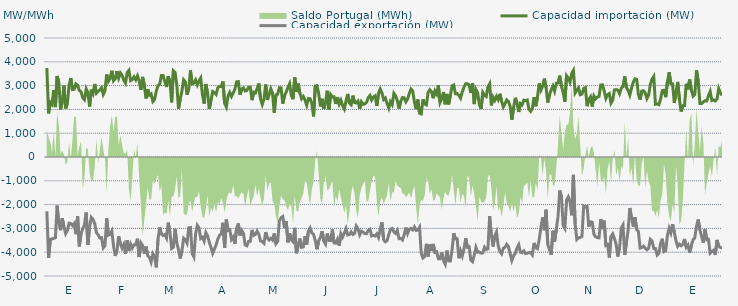
| Category | Capacidad importación (MW) | Capacidad exportación (MW) |
|---|---|---|
| 0 | 3741.458 | -2283.75 |
| 1900-01-01 | 1833.125 | -4242.5 |
| 1900-01-02 | 2294.25 | -3457.125 |
| 1900-01-03 | 2210.833 | -3444.375 |
| 1900-01-04 | 2808.75 | -3420 |
| 1900-01-05 | 2098.083 | -3391.875 |
| 1900-01-06 | 3404.792 | -2041.875 |
| 1900-01-07 | 3136.875 | -2790.292 |
| 1900-01-08 | 2001.25 | -3075.75 |
| 1900-01-09 | 2334.583 | -2570.625 |
| 1900-01-10 | 2998.542 | -2932.5 |
| 1900-01-11 | 2041.583 | -3219.375 |
| 1900-01-12 | 2261.875 | -3091.875 |
| 1900-01-13 | 3017.292 | -2780.625 |
| 1900-01-14 | 3316.667 | -2796 |
| 1900-01-15 | 2831.875 | -2880.375 |
| 1900-01-16 | 2848.875 | -2791.375 |
| 1900-01-17 | 3072.083 | -3242.5 |
| 1900-01-18 | 3008.75 | -2494.125 |
| 1900-01-19 | 2789.75 | -3753.75 |
| 1900-01-20 | 2740.75 | -3208.125 |
| 1900-01-21 | 2484.167 | -3015 |
| 1900-01-22 | 2405.083 | -2845.208 |
| 1900-01-23 | 2862.542 | -2330.625 |
| 1900-01-24 | 2704.875 | -3693.75 |
| 1900-01-25 | 2121.458 | -2932.25 |
| 1900-01-26 | 2826.875 | -2536.458 |
| 1900-01-27 | 2666.25 | -2617.875 |
| 1900-01-28 | 3068.375 | -2797.625 |
| 1900-01-29 | 2681.458 | -3181.875 |
| 1900-01-30 | 2762.167 | -3268.125 |
| 1900-01-31 | 2816.458 | -3403.125 |
| 1900-02-01 | 2908.75 | -3388.125 |
| 1900-02-02 | 2628.458 | -3817.5 |
| 1900-02-03 | 2784.5 | -3729.375 |
| 1900-02-04 | 3466.875 | -2575.375 |
| 1900-02-05 | 3180 | -3284.375 |
| 1900-02-06 | 3301.25 | -3251.25 |
| 1900-02-07 | 3624.375 | -3114.375 |
| 1900-02-08 | 3203.333 | -3733.125 |
| 1900-02-09 | 3288.125 | -4155 |
| 1900-02-10 | 3606.25 | -3943.125 |
| 1900-02-11 | 3313.75 | -3335.625 |
| 1900-02-12 | 3531.417 | -3646.875 |
| 1900-02-13 | 3433.125 | -3826.875 |
| 1900-02-14 | 3223.542 | -3673.333 |
| 1900-02-15 | 3103.75 | -4066.875 |
| 1900-02-16 | 3546.25 | -3496.875 |
| 1900-02-17 | 3638.5 | -3952.5 |
| 1900-02-18 | 3210 | -3661.875 |
| 1900-02-19 | 3255.417 | -3826.875 |
| 1900-02-20 | 3367.5 | -3690 |
| 1900-02-21 | 3244.5 | -3684.375 |
| 1900-02-22 | 3411.458 | -3435 |
| 1900-02-23 | 3192.708 | -4203.75 |
| 1900-02-24 | 2825 | -3605.625 |
| 1900-02-25 | 3365.667 | -3718.625 |
| 1900-02-26 | 3014.375 | -4063.125 |
| 1900-02-27 | 2458.292 | -3762 |
| 1900-02-28 | 2845.5 | -4151.25 |
| 1900-02-28 | 2597.292 | -4215 |
| 1900-03-01 | 2650.375 | -4415.625 |
| 1900-03-02 | 2331.042 | -4066.875 |
| 1900-03-03 | 2415.625 | -4185 |
| 1900-03-04 | 2763.875 | -4638.75 |
| 1900-03-05 | 2996.042 | -3465 |
| 1900-03-06 | 3054.375 | -2960.625 |
| 1900-03-07 | 3421.875 | -3238.875 |
| 1900-03-08 | 3422.25 | -3301.458 |
| 1900-03-09 | 3168.75 | -3257.708 |
| 1900-03-10 | 2940.75 | -3407.5 |
| 1900-03-11 | 3391.875 | -2758.75 |
| 1900-03-12 | 3159.375 | -3175.208 |
| 1900-03-13 | 2294.792 | -3843.75 |
| 1900-03-14 | 3620.625 | -3793.125 |
| 1900-03-15 | 3550.208 | -3016.875 |
| 1900-03-16 | 3036.458 | -3616.875 |
| 1900-03-17 | 2023.333 | -3886.25 |
| 1900-03-18 | 2440.208 | -4263.75 |
| 1900-03-19 | 2764.167 | -3943.125 |
| 1900-03-20 | 3245.625 | -3410.667 |
| 1900-03-21 | 3161.25 | -3470.625 |
| 1900-03-22 | 2621.458 | -3614.625 |
| 1900-03-23 | 2861.25 | -2975.958 |
| 1900-03-24 | 3635.217 | -2962.391 |
| 1900-03-25 | 3071.083 | -4052.75 |
| 1900-03-26 | 3103.625 | -4196.25 |
| 1900-03-27 | 3238.125 | -3235.75 |
| 1900-03-28 | 3031.875 | -2868.708 |
| 1900-03-29 | 3202.5 | -2981.292 |
| 1900-03-30 | 3320.625 | -3422.292 |
| 1900-03-31 | 2615.625 | -3370.417 |
| 1900-04-01 | 2244.375 | -3535.625 |
| 1900-04-02 | 3067.5 | -3176.25 |
| 1900-04-03 | 2692.458 | -3306.875 |
| 1900-04-04 | 2025 | -3576.042 |
| 1900-04-05 | 2373.833 | -3795 |
| 1900-04-06 | 2750.458 | -4045 |
| 1900-04-07 | 2704.167 | -3868.417 |
| 1900-04-08 | 2628.75 | -3691.667 |
| 1900-04-09 | 2910 | -3448.125 |
| 1900-04-10 | 2971.875 | -3293.375 |
| 1900-04-11 | 2958.5 | -3229.167 |
| 1900-04-12 | 3174.375 | -2764.583 |
| 1900-04-13 | 2253.75 | -3813.75 |
| 1900-04-14 | 2100 | -2628.667 |
| 1900-04-15 | 2557.5 | -3088.333 |
| 1900-04-16 | 2713.125 | -3062.25 |
| 1900-04-17 | 2546.875 | -3463.625 |
| 1900-04-18 | 2686.458 | -3359.458 |
| 1900-04-19 | 2850 | -3646.042 |
| 1900-04-20 | 3159.375 | -2992.292 |
| 1900-04-21 | 3166.875 | -2793.125 |
| 1900-04-22 | 2613.75 | -3298.833 |
| 1900-04-23 | 2857.5 | -3089.625 |
| 1900-04-24 | 2903.875 | -3210.125 |
| 1900-04-25 | 2772 | -3696.792 |
| 1900-04-26 | 2797.5 | -3731.25 |
| 1900-04-27 | 2930.625 | -3545.625 |
| 1900-04-28 | 2932.5 | -3541.875 |
| 1900-04-29 | 2390.625 | -3064.167 |
| 1900-04-30 | 2726.25 | -3293.333 |
| 1900-05-01 | 2694.375 | -3252.708 |
| 1900-05-02 | 2878.125 | -3111.875 |
| 1900-05-03 | 3088.125 | -3247.5 |
| 1900-05-04 | 2435.625 | -3528.958 |
| 1900-05-05 | 2206.875 | -3547.708 |
| 1900-05-06 | 2435.625 | -3618.75 |
| 1900-05-07 | 3046.875 | -3157.917 |
| 1900-05-08 | 2400 | -3406.875 |
| 1900-05-09 | 2640 | -3488.125 |
| 1900-05-10 | 2866.875 | -3413.542 |
| 1900-05-11 | 2675.625 | -3486.458 |
| 1900-05-12 | 1861.25 | -3211.667 |
| 1900-05-13 | 2611.875 | -3644.375 |
| 1900-05-14 | 2638.125 | -3547.083 |
| 1900-05-15 | 2906.25 | -2688.333 |
| 1900-05-16 | 2904.375 | -2549.583 |
| 1900-05-17 | 2240.625 | -2502.083 |
| 1900-05-18 | 2576.25 | -2981.667 |
| 1900-05-19 | 2732.25 | -2689.375 |
| 1900-05-20 | 2919.375 | -3586.875 |
| 1900-05-21 | 3078.75 | -3206.25 |
| 1900-05-22 | 2587.5 | -3481.875 |
| 1900-05-23 | 2430 | -3560.625 |
| 1900-05-24 | 3341.25 | -2977.542 |
| 1900-05-25 | 2733.75 | -4046.25 |
| 1900-05-26 | 3080.625 | -3725.417 |
| 1900-05-27 | 2681.25 | -3429.375 |
| 1900-05-28 | 2448.75 | -3793.125 |
| 1900-05-29 | 2544.125 | -3778.125 |
| 1900-05-30 | 2394.958 | -3328.125 |
| 1900-05-31 | 2175 | -3678.75 |
| 1900-06-01 | 2461.167 | -3117.375 |
| 1900-06-02 | 2448.75 | -2981.542 |
| 1900-06-03 | 2255.042 | -3185.833 |
| 1900-06-04 | 1708.042 | -3250.208 |
| 1900-06-05 | 2981.25 | -3508.125 |
| 1900-06-06 | 2998.125 | -3877.5 |
| 1900-06-07 | 2664.375 | -3519.375 |
| 1900-06-08 | 2124.375 | -3382.5 |
| 1900-06-09 | 2446.875 | -3115.792 |
| 1900-06-10 | 2015.417 | -3534.375 |
| 1900-06-11 | 2289.375 | -3658.125 |
| 1900-06-12 | 2784.375 | -3211.083 |
| 1900-06-13 | 1993.125 | -3504.792 |
| 1900-06-14 | 2624.875 | -3506.458 |
| 1900-06-15 | 2523.75 | -3042.583 |
| 1900-06-16 | 2531.25 | -3613.125 |
| 1900-06-17 | 2229.583 | -3620.625 |
| 1900-06-18 | 2515.875 | -3455.625 |
| 1900-06-19 | 2227.5 | -3723.75 |
| 1900-06-20 | 2388.375 | -3217.458 |
| 1900-06-21 | 2157.875 | -3361.542 |
| 1900-06-22 | 2014.583 | -3202.708 |
| 1900-06-23 | 2357.917 | -3006.583 |
| 1900-06-24 | 2647.75 | -3275.625 |
| 1900-06-25 | 2259.375 | -3258.75 |
| 1900-06-26 | 2191.875 | -3148.125 |
| 1900-06-27 | 2578.125 | -3256.875 |
| 1900-06-28 | 2289.375 | -3211.875 |
| 1900-06-29 | 2272.917 | -2898.25 |
| 1900-06-30 | 2349.75 | -3012.25 |
| 1900-07-01 | 2034.167 | -3270 |
| 1900-07-02 | 2319.375 | -3116.25 |
| 1900-07-03 | 2214.375 | -3159.375 |
| 1900-07-04 | 2229.167 | -3217.5 |
| 1900-07-05 | 2296.875 | -3223.125 |
| 1900-07-06 | 2497.5 | -3080.208 |
| 1900-07-07 | 2585.5 | -3034.292 |
| 1900-07-08 | 2394.375 | -3318.75 |
| 1900-07-09 | 2520 | -3286.875 |
| 1900-07-10 | 2570.625 | -3320.625 |
| 1900-07-11 | 2145 | -3229.583 |
| 1900-07-12 | 2673.75 | -3384.375 |
| 1900-07-13 | 2855.625 | -3040.333 |
| 1900-07-14 | 2689.875 | -2741.708 |
| 1900-07-15 | 2413.125 | -3485.625 |
| 1900-07-16 | 2476.875 | -3564.375 |
| 1900-07-17 | 2258.75 | -3510 |
| 1900-07-18 | 2056.875 | -3258.75 |
| 1900-07-19 | 2326.875 | -3036.667 |
| 1900-07-20 | 2203.125 | -3003.75 |
| 1900-07-21 | 2675.333 | -3153.417 |
| 1900-07-22 | 2572.5 | -3211.875 |
| 1900-07-23 | 2368.125 | -3082.917 |
| 1900-07-24 | 2032.5 | -3433.125 |
| 1900-07-25 | 2340 | -3418.125 |
| 1900-07-26 | 2499.375 | -3485.625 |
| 1900-07-27 | 2488.125 | -3277.5 |
| 1900-07-28 | 2317.5 | -2963.167 |
| 1900-07-29 | 2431.875 | -3217.5 |
| 1900-07-30 | 2668.125 | -3039.375 |
| 1900-07-31 | 2855.625 | -2998.125 |
| 1900-08-01 | 2778.75 | -3061.667 |
| 1900-08-02 | 2311.875 | -2941.042 |
| 1900-08-03 | 2010 | -3084.375 |
| 1900-08-04 | 2411.25 | -3065.625 |
| 1900-08-05 | 1837.917 | -2945.625 |
| 1900-08-06 | 1809.167 | -4055.625 |
| 1900-08-07 | 2419.792 | -4241.25 |
| 1900-08-08 | 2227.5 | -4173.75 |
| 1900-08-09 | 2191.875 | -3648.75 |
| 1900-08-10 | 2715 | -4183.125 |
| 1900-08-11 | 2826.625 | -3667.292 |
| 1900-08-12 | 2745 | -3950.625 |
| 1900-08-13 | 2467.5 | -3652.625 |
| 1900-08-14 | 2771.25 | -4006.875 |
| 1900-08-15 | 2640 | -3980.625 |
| 1900-08-16 | 3016.875 | -4271.25 |
| 1900-08-17 | 2292.292 | -4271.25 |
| 1900-08-18 | 2448.75 | -4010.625 |
| 1900-08-19 | 2730 | -4357.5 |
| 1900-08-20 | 2214.75 | -4501.875 |
| 1900-08-21 | 2650.208 | -3931.667 |
| 1900-08-22 | 2212.5 | -4361.25 |
| 1900-08-23 | 2565 | -4370.625 |
| 1900-08-24 | 2988.75 | -3920.625 |
| 1900-08-25 | 3024.375 | -3204.083 |
| 1900-08-26 | 2656.875 | -3437.708 |
| 1900-08-27 | 2664.375 | -3437.5 |
| 1900-08-28 | 2587.5 | -4254.375 |
| 1900-08-29 | 2473.125 | -3939.583 |
| 1900-08-30 | 2737.5 | -4156.875 |
| 1900-08-31 | 2932.5 | -3862.5 |
| 1900-09-01 | 3080.625 | -3412.708 |
| 1900-09-02 | 3078.125 | -3793.125 |
| 1900-09-03 | 3031.25 | -3776.25 |
| 1900-09-04 | 2689.875 | -4331.25 |
| 1900-09-05 | 3104.042 | -4396.875 |
| 1900-09-06 | 2223.25 | -4126.875 |
| 1900-09-07 | 2830.208 | -3799.583 |
| 1900-09-08 | 2694.375 | -3999.792 |
| 1900-09-09 | 2193.542 | -3994.167 |
| 1900-09-10 | 2019.375 | -4039.792 |
| 1900-09-11 | 2710.792 | -4026.667 |
| 1900-09-12 | 2589.292 | -3790.625 |
| 1900-09-13 | 2542.5 | -3888.75 |
| 1900-09-14 | 2943.75 | -3856.875 |
| 1900-09-15 | 3076.875 | -2486 |
| 1900-09-16 | 2169.583 | -3271.875 |
| 1900-09-17 | 2510.875 | -3762.292 |
| 1900-09-18 | 2379.375 | -3315.625 |
| 1900-09-19 | 2548.125 | -3149.875 |
| 1900-09-20 | 2405.625 | -3725.625 |
| 1900-09-21 | 2655.792 | -3978.75 |
| 1900-09-22 | 2338.917 | -4070.625 |
| 1900-09-23 | 2100.75 | -3836.25 |
| 1900-09-24 | 2239.583 | -3791.25 |
| 1900-09-25 | 2398.417 | -3671.25 |
| 1900-09-26 | 2333.375 | -3772.5 |
| 1900-09-27 | 2128.125 | -4065 |
| 1900-09-28 | 1568.375 | -4348.125 |
| 1900-09-29 | 2080.083 | -4146.125 |
| 1900-09-30 | 2486.208 | -4052.083 |
| 1900-10-01 | 2275.5 | -3824.583 |
| 1900-10-02 | 1891.708 | -3681.25 |
| 1900-10-03 | 2248.292 | -4001.25 |
| 1900-10-04 | 2190.75 | -4023.75 |
| 1900-10-05 | 2386.583 | -3945 |
| 1900-10-06 | 2366.708 | -4057.5 |
| 1900-10-07 | 2393.375 | -4042.25 |
| 1900-10-08 | 2007.375 | -4017.708 |
| 1900-10-09 | 1918.833 | -4016.25 |
| 1900-10-10 | 2042.417 | -4115.625 |
| 1900-10-11 | 2516.25 | -3611.25 |
| 1900-10-12 | 2132.708 | -3815.625 |
| 1900-10-13 | 2530.208 | -3849.375 |
| 1900-10-14 | 3090 | -3459.375 |
| 1900-10-15 | 2808.75 | -2974.875 |
| 1900-10-16 | 2978.125 | -2539.125 |
| 1900-10-17 | 3292.5 | -3075.208 |
| 1900-10-18 | 2935 | -2217.083 |
| 1900-10-19 | 2289.583 | -3673.125 |
| 1900-10-20 | 2619.375 | -3890.625 |
| 1900-10-21 | 2814.792 | -4110 |
| 1900-10-22 | 2979.375 | -3099.375 |
| 1900-10-23 | 2767.5 | -3556.875 |
| 1900-10-24 | 3099.375 | -3031.875 |
| 1900-10-25 | 3111.25 | -2508.75 |
| 1900-10-26 | 3418.125 | -1406.875 |
| 1900-10-27 | 2979.6 | -1681.6 |
| 1900-10-28 | 2705.333 | -2868.75 |
| 1900-10-29 | 2324.458 | -2999 |
| 1900-10-30 | 3414.375 | -1815.417 |
| 1900-10-31 | 3313.125 | -1677.917 |
| 1900-11-01 | 3144.583 | -1882.667 |
| 1900-11-02 | 3511.875 | -2448.75 |
| 1900-11-03 | 3639.375 | -750.708 |
| 1900-11-04 | 2688.958 | -2820 |
| 1900-11-05 | 2797.542 | -3465 |
| 1900-11-06 | 2902.5 | -3399.375 |
| 1900-11-07 | 2618.042 | -3382.5 |
| 1900-11-08 | 2643.417 | -3336.125 |
| 1900-11-09 | 2878.125 | -2058.75 |
| 1900-11-10 | 2915 | -2101.875 |
| 1900-11-11 | 2137.708 | -2068.125 |
| 1900-11-12 | 2411.042 | -2928.75 |
| 1900-11-13 | 2524.375 | -2722.5 |
| 1900-11-14 | 2118.542 | -2739.375 |
| 1900-11-15 | 2559.458 | -3244.292 |
| 1900-11-16 | 2440.833 | -3354.75 |
| 1900-11-17 | 2521.167 | -3387.25 |
| 1900-11-18 | 2546.333 | -3396.375 |
| 1900-11-19 | 3028.125 | -2606.25 |
| 1900-11-20 | 3031.875 | -3030 |
| 1900-11-21 | 2773.917 | -2675.625 |
| 1900-11-22 | 2465.417 | -3720 |
| 1900-11-23 | 2620.708 | -3684.375 |
| 1900-11-24 | 2665.625 | -4224.375 |
| 1900-11-25 | 2266.875 | -3343.125 |
| 1900-11-26 | 2395.625 | -3230.625 |
| 1900-11-27 | 2820.417 | -3421.875 |
| 1900-11-28 | 2831.667 | -3678.75 |
| 1900-11-29 | 2807.708 | -4181.25 |
| 1900-11-30 | 2656.917 | -3808.125 |
| 1900-12-01 | 2889.375 | -2983.125 |
| 1900-12-02 | 2955.417 | -2856.75 |
| 1900-12-03 | 3390.125 | -4111.875 |
| 1900-12-04 | 2918.167 | -3607.5 |
| 1900-12-05 | 2805 | -3067.5 |
| 1900-12-06 | 2603.792 | -2143.125 |
| 1900-12-07 | 2889.792 | -2566.125 |
| 1900-12-08 | 3138.75 | -2918.333 |
| 1900-12-09 | 3284.583 | -2531.167 |
| 1900-12-10 | 3266.875 | -3054.375 |
| 1900-12-11 | 2630.625 | -3127.125 |
| 1900-12-12 | 2410.625 | -3825 |
| 1900-12-13 | 2771.375 | -3800.625 |
| 1900-12-14 | 2785.375 | -3746.25 |
| 1900-12-15 | 2693.917 | -3833.125 |
| 1900-12-16 | 2453.958 | -3898.125 |
| 1900-12-17 | 2603.042 | -3832.458 |
| 1900-12-18 | 3040.208 | -3455.125 |
| 1900-12-19 | 3274.75 | -3527.125 |
| 1900-12-20 | 3387 | -3843.75 |
| 1900-12-21 | 2216.667 | -3847.5 |
| 1900-12-22 | 2229.75 | -4117.5 |
| 1900-12-23 | 2201.625 | -4044.375 |
| 1900-12-24 | 2438.958 | -3630 |
| 1900-12-25 | 2792.375 | -3435 |
| 1900-12-26 | 2803.958 | -3975 |
| 1900-12-27 | 2513.542 | -3933.75 |
| 1900-12-28 | 3165 | -3294.375 |
| 1900-12-29 | 3560.625 | -2987.875 |
| 1900-12-30 | 3075.25 | -3193.125 |
| 1900-12-31 | 3073.417 | -2827.208 |
| 1901-01-01 | 2270.625 | -3162.75 |
| 1901-01-02 | 2727.5 | -3519.375 |
| 1901-01-03 | 3154.417 | -3755.625 |
| 1901-01-04 | 2418.792 | -3661.875 |
| 1901-01-05 | 1908.75 | -3729.375 |
| 1901-01-06 | 2155 | -3669.625 |
| 1901-01-07 | 2159.708 | -3444.375 |
| 1901-01-08 | 3076.458 | -3791.25 |
| 1901-01-09 | 2842.292 | -3698.125 |
| 1901-01-10 | 3253.542 | -4020 |
| 1901-01-11 | 2809.042 | -3716.25 |
| 1901-01-12 | 2558.833 | -3474.375 |
| 1901-01-13 | 2631.875 | -3401.25 |
| 1901-01-14 | 3639.375 | -2911.875 |
| 1901-01-15 | 3192.292 | -2627.375 |
| 1901-01-16 | 2248.167 | -3073.125 |
| 1901-01-17 | 2244.375 | -3343.125 |
| 1901-01-18 | 2309.583 | -3596.625 |
| 1901-01-19 | 2366.167 | -3043.125 |
| 1901-01-20 | 2354.167 | -3474.375 |
| 1901-01-21 | 2578.958 | -3457.5 |
| 1901-01-22 | 2753.5 | -4040.625 |
| 1901-01-23 | 2372.208 | -3969.375 |
| 1901-01-24 | 2398.458 | -3918.75 |
| 1901-01-25 | 2354.167 | -4115.625 |
| 1901-01-26 | 2437.625 | -3484.625 |
| 1901-01-27 | 2874.167 | -3740.625 |
| 1901-01-28 | 2690.583 | -3803.75 |
| 1901-01-29 | 2590.875 | -3828.75 |